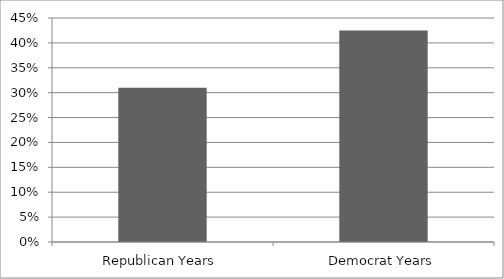
| Category | Foreign |
|---|---|
| Republican Years | 0.31 |
| Democrat Years | 0.425 |